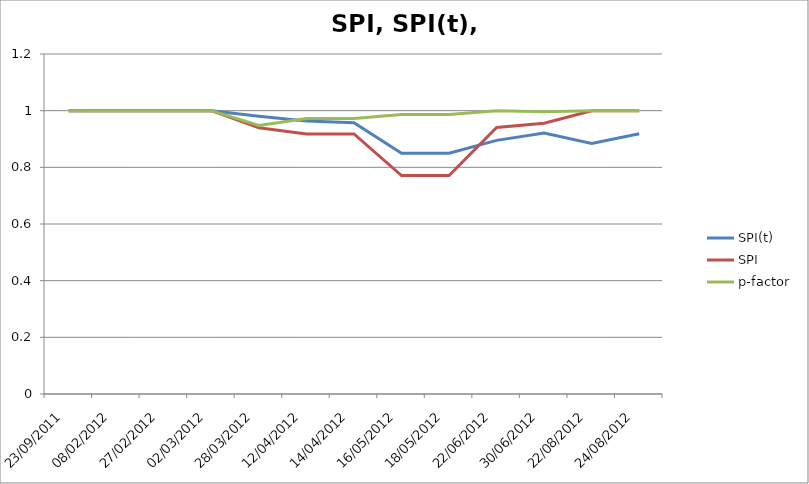
| Category | SPI(t) | SPI | p-factor |
|---|---|---|---|
| 23/09/2011 | 1 | 1 | 1 |
| 08/02/2012 | 1 | 1 | 1 |
| 27/02/2012 | 1 | 1 | 1 |
| 02/03/2012 | 1 | 1 | 1 |
| 28/03/2012 | 0.981 | 0.94 | 0.948 |
| 12/04/2012 | 0.963 | 0.918 | 0.973 |
| 14/04/2012 | 0.958 | 0.918 | 0.973 |
| 16/05/2012 | 0.849 | 0.771 | 0.986 |
| 18/05/2012 | 0.849 | 0.771 | 0.986 |
| 22/06/2012 | 0.895 | 0.94 | 1 |
| 30/06/2012 | 0.921 | 0.956 | 0.996 |
| 22/08/2012 | 0.884 | 1 | 1 |
| 24/08/2012 | 0.919 | 1 | 1 |